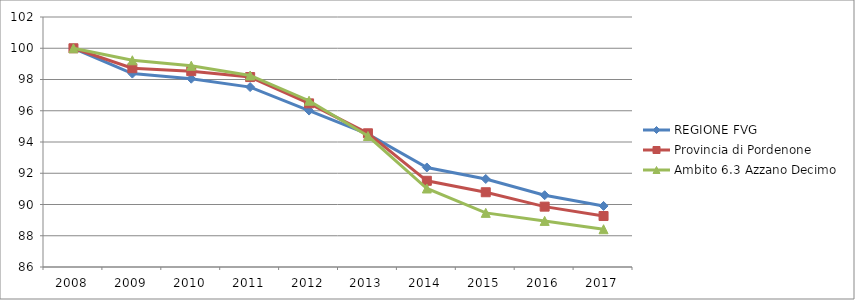
| Category | REGIONE FVG | Provincia di Pordenone | Ambito 6.3 Azzano Decimo |
|---|---|---|---|
| 2008.0 | 100 | 100 | 100 |
| 2009.0 | 98.378 | 98.723 | 99.229 |
| 2010.0 | 98.049 | 98.535 | 98.88 |
| 2011.0 | 97.515 | 98.157 | 98.256 |
| 2012.0 | 96.012 | 96.472 | 96.641 |
| 2013.0 | 94.5 | 94.558 | 94.383 |
| 2014.0 | 92.37 | 91.517 | 91.024 |
| 2015.0 | 91.632 | 90.784 | 89.464 |
| 2016.0 | 90.595 | 89.863 | 88.95 |
| 2017.0 | 89.908 | 89.262 | 88.418 |